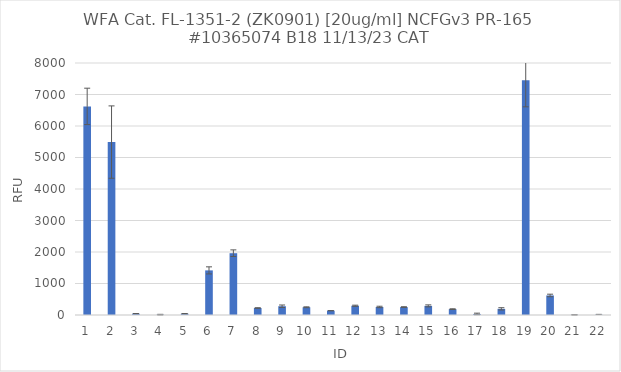
| Category | RFU |
|---|---|
| 0 | 6622.25 |
| 1 | 5489.75 |
| 2 | 42.25 |
| 3 | 10.5 |
| 4 | 40.5 |
| 5 | 1416.25 |
| 6 | 1961.75 |
| 7 | 221.5 |
| 8 | 278.5 |
| 9 | 245.75 |
| 10 | 137 |
| 11 | 293.5 |
| 12 | 255.5 |
| 13 | 251.25 |
| 14 | 289.25 |
| 15 | 186 |
| 16 | 33.25 |
| 17 | 195.75 |
| 18 | 7455.75 |
| 19 | 620.25 |
| 20 | 5 |
| 21 | 9.5 |